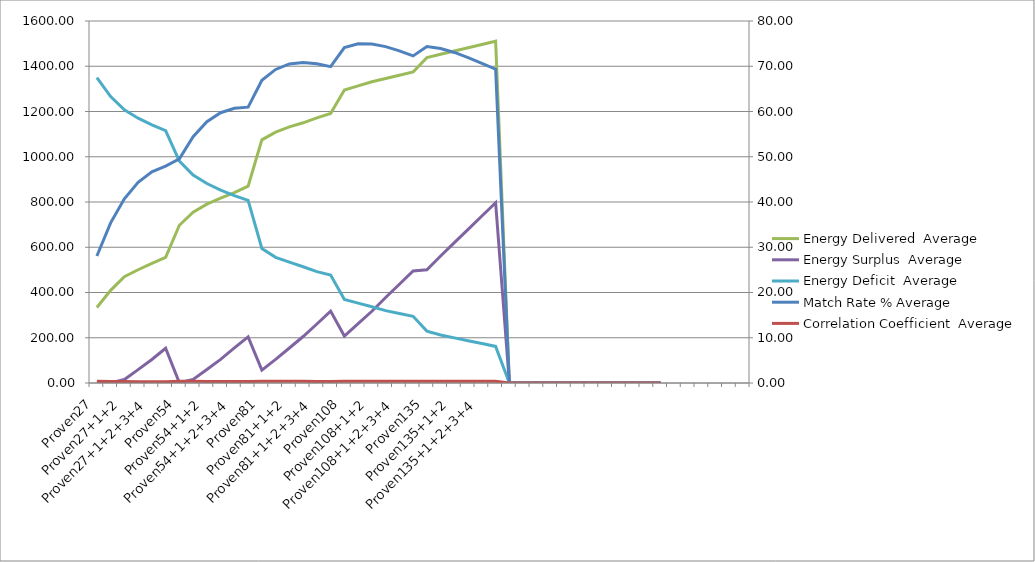
| Category | Energy Delivered  Average | Energy Surplus  Average | Energy Deficit  Average |
|---|---|---|---|
| Proven27 | 333.88 | 0 | 1350 |
| Proven27+1 | 409.655 | 0.175 | 1266.15 |
| Proven27+1+2 | 469.455 | 15.455 | 1207.42 |
| Proven27+1+2+3 | 500.5 | 59.225 | 1170.495 |
| Proven27+1+2+3+4 | 528.855 | 104.06 | 1140.705 |
| Proven27+1+2+3+4+5 | 555.755 | 153.57 | 1115.21 |
| Proven54 | 697.095 | 0.955 | 980.495 |
| Proven54+1 | 755.335 | 16.095 | 919.455 |
| Proven54+1+2 | 790.625 | 59.285 | 881.865 |
| Proven54+1+2+3 | 817.545 | 104.12 | 852.08 |
| Proven54+1+2+3+4 | 841.515 | 154.92 | 827.995 |
| Proven54+1+2+3+4+5 | 869.84 | 203.555 | 806.885 |
| Proven81 | 1074.675 | 56.915 | 594.51 |
| Proven81+1 | 1108.45 | 104.585 | 555.395 |
| Proven81+1+2 | 1131.775 | 154.58 | 533.945 |
| Proven81+1+2+3 | 1150.1 | 205.47 | 513.86 |
| Proven81+1+2+3+4 | 1171.585 | 260.835 | 492.265 |
| Proven81+1+2+3+4+5 | 1190.98 | 317.65 | 477.29 |
| Proven108 | 1294.675 | 207.425 | 368.995 |
| Proven108+1 | 1313 | 262.24 | 352.885 |
| Proven108+1+2 | 1331.325 | 317.06 | 336.775 |
| Proven108+1+2+3 | 1345.89 | 377.965 | 319.715 |
| Proven108+1+2+3+4 | 1360.285 | 436.63 | 307.15 |
| Proven108+1+2+3+4+5 | 1374.68 | 495.29 | 294.58 |
| Proven135 | 1438.14 | 500.44 | 229.415 |
| Proven135+1 | 1453.16 | 561.315 | 211.925 |
| Proven135+1+2 | 1467.555 | 620.235 | 199.355 |
| Proven135+1+2+3 | 1481.95 | 679.155 | 186.79 |
| Proven135+1+2+3+4 | 1496.345 | 738.07 | 174.225 |
| Proven135+1+2+3+4+5 | 1510.745 | 796.985 | 161.66 |